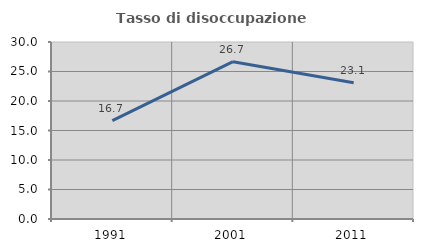
| Category | Tasso di disoccupazione giovanile  |
|---|---|
| 1991.0 | 16.667 |
| 2001.0 | 26.667 |
| 2011.0 | 23.077 |